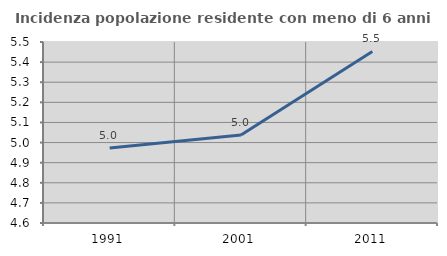
| Category | Incidenza popolazione residente con meno di 6 anni |
|---|---|
| 1991.0 | 4.973 |
| 2001.0 | 5.038 |
| 2011.0 | 5.453 |